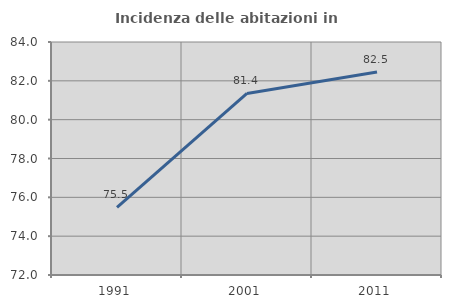
| Category | Incidenza delle abitazioni in proprietà  |
|---|---|
| 1991.0 | 75.487 |
| 2001.0 | 81.352 |
| 2011.0 | 82.459 |